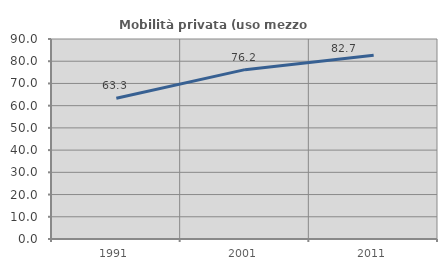
| Category | Mobilità privata (uso mezzo privato) |
|---|---|
| 1991.0 | 63.314 |
| 2001.0 | 76.211 |
| 2011.0 | 82.734 |